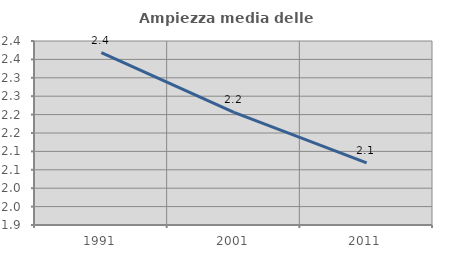
| Category | Ampiezza media delle famiglie |
|---|---|
| 1991.0 | 2.369 |
| 2001.0 | 2.206 |
| 2011.0 | 2.069 |